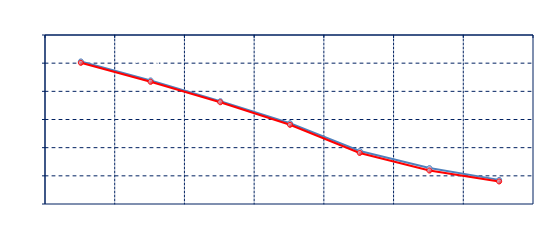
| Category | Series 0 | Series 1 |
|---|---|---|
| DEC, MAR | -18.75 | -19.75 |
| DEC, MAY | -32.25 | -33.25 |
| DEC, JUL | -47 | -47.75 |
| DEC, SEP | -62.625 | -63.75 |
| DEC, DEC | -82.375 | -83.75 |
| DEC, MAR | -94.5 | -96.25 |
| DEC, MAY | -102.875 | -104 |